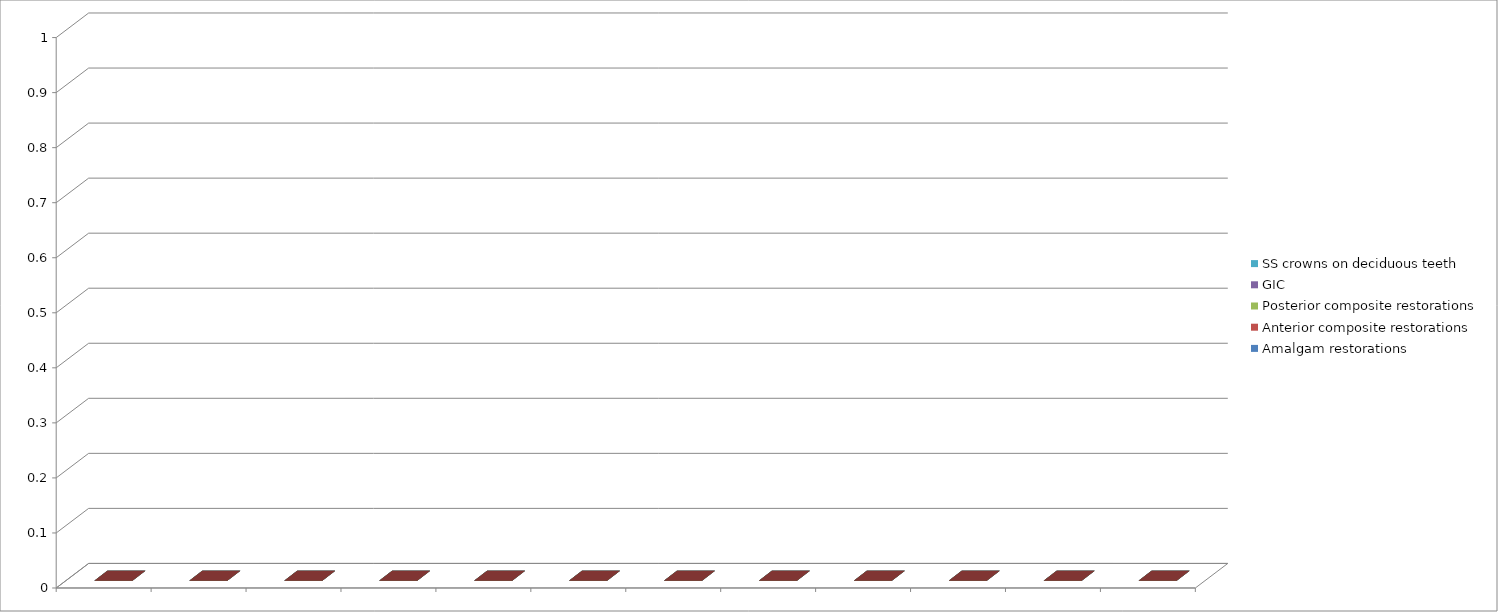
| Category | Amalgam restorations | Anterior composite restorations | Posterior composite restorations | GIC | SS crowns on deciduous teeth |
|---|---|---|---|---|---|
| 0 | 0 | 0 | 0 | 0 | 0 |
| 1 | 0 | 0 | 0 | 0 | 0 |
| 2 | 0 | 0 | 0 | 0 | 0 |
| 3 | 0 | 0 | 0 | 0 | 0 |
| 4 | 0 | 0 | 0 | 0 | 0 |
| 5 | 0 | 0 | 0 | 0 | 0 |
| 6 | 0 | 0 | 0 | 0 | 0 |
| 7 | 0 | 0 | 0 | 0 | 0 |
| 8 | 0 | 0 | 0 | 0 | 0 |
| 9 | 0 | 0 | 0 | 0 | 0 |
| 10 | 0 | 0 | 0 | 0 | 0 |
| 11 | 0 | 0 | 0 | 0 | 0 |